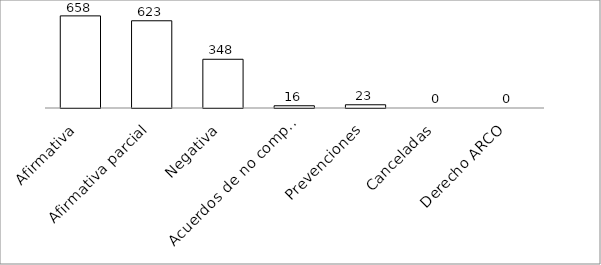
| Category | Series 0 |
|---|---|
| Afirmativa | 658 |
| Afirmativa parcial | 623 |
| Negativa | 348 |
| Acuerdos de no competencia | 16 |
| Prevenciones | 23 |
| Canceladas | 0 |
| Derecho ARCO | 0 |